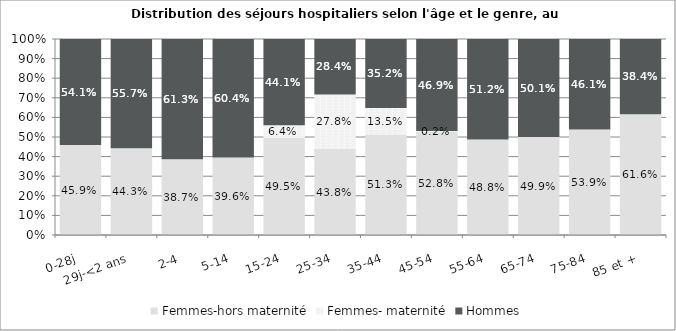
| Category | Femmes-hors maternité | Femmes- maternité | Hommes |
|---|---|---|---|
| 0-28j | 0.459 | 0 | 0.541 |
| 29j-<2 ans | 0.443 | 0 | 0.557 |
|   2-4 | 0.387 | 0 | 0.613 |
|   5-14 | 0.396 | 0 | 0.604 |
|  15-24 | 0.495 | 0.064 | 0.441 |
|  25-34 | 0.438 | 0.278 | 0.284 |
|  35-44 | 0.513 | 0.135 | 0.352 |
|  45-54 | 0.528 | 0.002 | 0.469 |
|  55-64 | 0.488 | 0 | 0.512 |
|  65-74 | 0.499 | 0 | 0.501 |
|  75-84 | 0.539 | 0 | 0.461 |
|  85 et + | 0.616 | 0 | 0.384 |